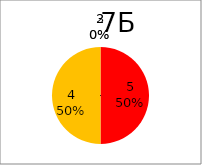
| Category | Series 0 |
|---|---|
| 5.0 | 5 |
| 4.0 | 5 |
| 3.0 | 0 |
| 2.0 | 0 |